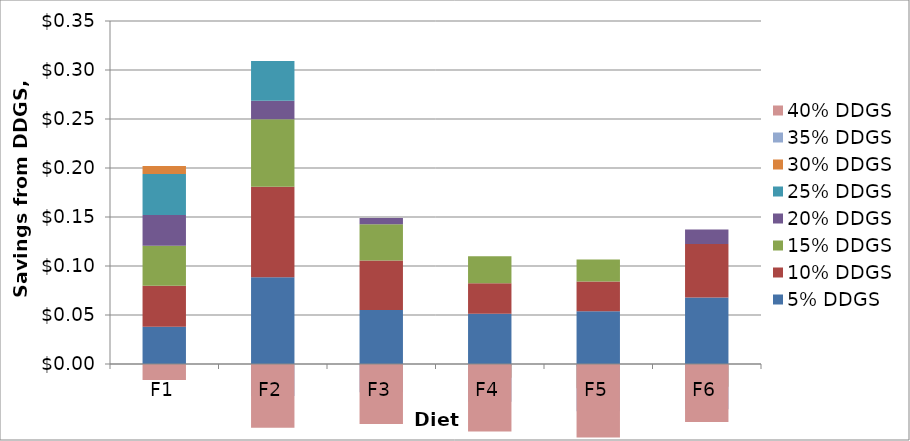
| Category | 5% DDGS | 10% DDGS | 15% DDGS | 20% DDGS | 25% DDGS | 30% DDGS | 35% DDGS | 40% DDGS |
|---|---|---|---|---|---|---|---|---|
| F1 | 0.038 | 0.042 | 0.041 | 0.031 | 0.042 | 0.008 | -0.016 | -0.017 |
| F2 | 0.089 | 0.092 | 0.069 | 0.019 | 0.041 | -0.033 | -0.033 | -0.031 |
| F3 | 0.055 | 0.051 | 0.037 | 0.006 | 0 | -0.029 | -0.032 | -0.027 |
| F4 | 0.051 | 0.031 | 0.028 | -0.002 | -0.012 | -0.024 | -0.031 | -0.024 |
| F5 | 0.054 | 0.03 | 0.023 | -0.002 | -0.022 | -0.024 | -0.027 | -0.023 |
| F6 | 0.068 | 0.055 | 0 | 0.015 | -0.023 | -0.023 | -0.013 | -0.028 |